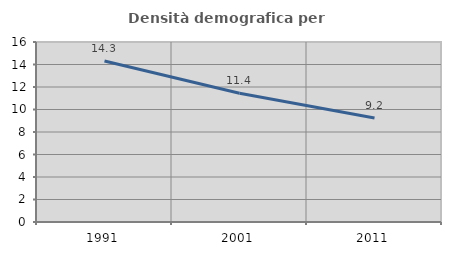
| Category | Densità demografica |
|---|---|
| 1991.0 | 14.307 |
| 2001.0 | 11.441 |
| 2011.0 | 9.249 |